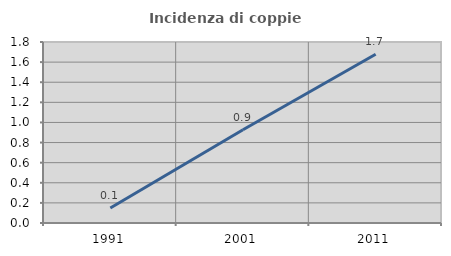
| Category | Incidenza di coppie miste |
|---|---|
| 1991.0 | 0.149 |
| 2001.0 | 0.928 |
| 2011.0 | 1.678 |